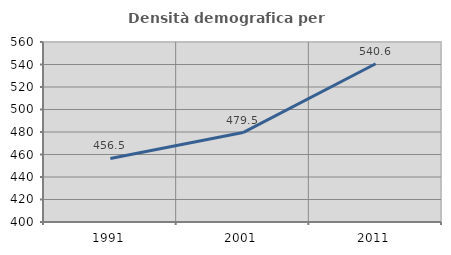
| Category | Densità demografica |
|---|---|
| 1991.0 | 456.52 |
| 2001.0 | 479.502 |
| 2011.0 | 540.638 |